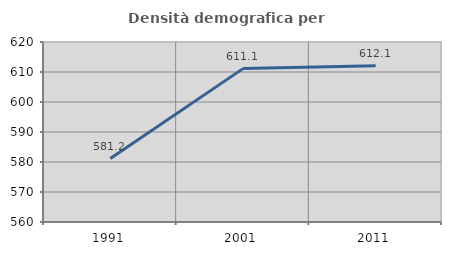
| Category | Densità demografica |
|---|---|
| 1991.0 | 581.155 |
| 2001.0 | 611.126 |
| 2011.0 | 612.101 |